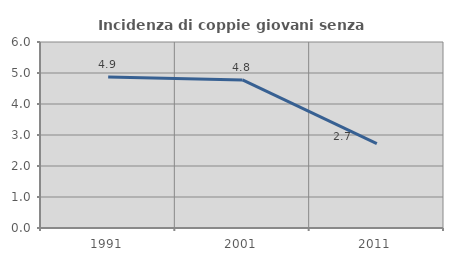
| Category | Incidenza di coppie giovani senza figli |
|---|---|
| 1991.0 | 4.871 |
| 2001.0 | 4.776 |
| 2011.0 | 2.722 |